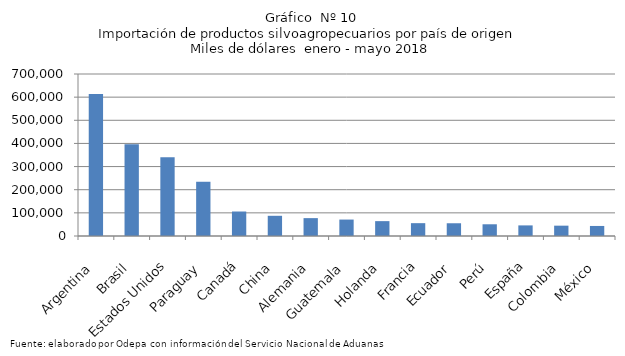
| Category | Series 0 |
|---|---|
| Argentina | 613057.881 |
| Brasil | 396778.096 |
| Estados Unidos | 340313.88 |
| Paraguay | 234381.227 |
| Canadá | 105808.187 |
| China | 87275.505 |
| Alemania | 77231.074 |
| Guatemala | 71013.849 |
| Holanda | 64249.495 |
| Francia | 55471.155 |
| Ecuador | 55057.472 |
| Perú | 50649.936 |
| España | 45815.103 |
| Colombia | 44655.573 |
| México | 43383.256 |